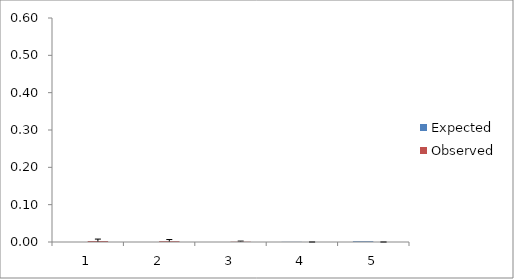
| Category | Expected | Observed |
|---|---|---|
| 0 | 0 | 0.003 |
| 1 | 0 | 0.002 |
| 2 | 0 | 0.001 |
| 3 | 0 | 0 |
| 4 | 0.002 | 0 |